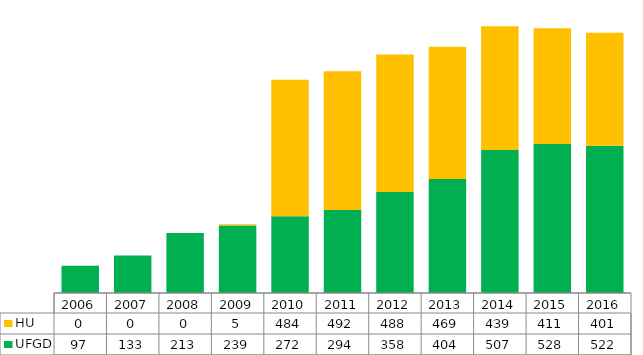
| Category | UFGD | HU |
|---|---|---|
| 2006.0 | 97 | 0 |
| 2007.0 | 133 | 0 |
| 2008.0 | 213 | 0 |
| 2009.0 | 239 | 5 |
| 2010.0 | 272 | 484 |
| 2011.0 | 294 | 492 |
| 2012.0 | 358 | 488 |
| 2013.0 | 404 | 469 |
| 2014.0 | 507 | 439 |
| 2015.0 | 528 | 411 |
| 2016.0 | 522 | 401 |